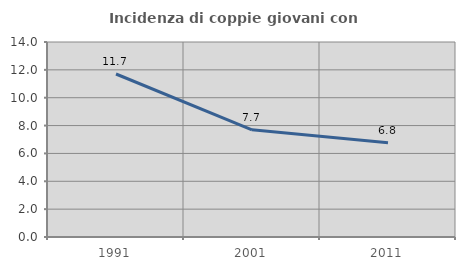
| Category | Incidenza di coppie giovani con figli |
|---|---|
| 1991.0 | 11.702 |
| 2001.0 | 7.697 |
| 2011.0 | 6.771 |